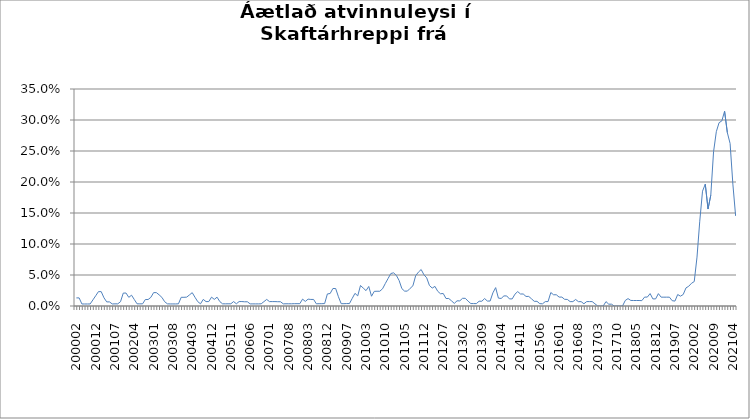
| Category | Series 0 |
|---|---|
| 200002 | 0.013 |
| 200003 | 0.013 |
| 200004 | 0.003 |
| 200005 | 0.003 |
| 200006 | 0.003 |
| 200007 | 0.003 |
| 200011 | 0.01 |
| 200012 | 0.017 |
| 200101 | 0.023 |
| 200102 | 0.023 |
| 200103 | 0.013 |
| 200104 | 0.007 |
| 200105 | 0.007 |
| 200106 | 0.003 |
| 200107 | 0.003 |
| 200108 | 0.003 |
| 200111 | 0.007 |
| 200112 | 0.021 |
| 200201 | 0.021 |
| 200202 | 0.014 |
| 200203 | 0.017 |
| 200204 | 0.01 |
| 200205 | 0.003 |
| 200206 | 0.003 |
| 200207 | 0.003 |
| 200210 | 0.01 |
| 200211 | 0.01 |
| 200212 | 0.014 |
| 200301 | 0.022 |
| 200302 | 0.022 |
| 200303 | 0.018 |
| 200304 | 0.014 |
| 200305 | 0.007 |
| 200306 | 0.003 |
| 200307 | 0.003 |
| 200308 | 0.003 |
| 200309 | 0.003 |
| 200310 | 0.004 |
| 200311 | 0.014 |
| 200312 | 0.014 |
| 200401 | 0.014 |
| 200402 | 0.018 |
| 200403 | 0.022 |
| 200404 | 0.014 |
| 200405 | 0.007 |
| 200406 | 0.004 |
| 200407 | 0.011 |
| 200408 | 0.007 |
| 200411 | 0.007 |
| 200412 | 0.014 |
| 200501 | 0.011 |
| 200502 | 0.014 |
| 200503 | 0.007 |
| 200504 | 0.004 |
| 200505 | 0.004 |
| 200510 | 0.004 |
| 200511 | 0.004 |
| 200512 | 0.007 |
| 200601 | 0.004 |
| 200602 | 0.007 |
| 200603 | 0.007 |
| 200604 | 0.007 |
| 200605 | 0.007 |
| 200606 | 0.003 |
| 200607 | 0.003 |
| 200608 | 0.003 |
| 200609 | 0.003 |
| 200610 | 0.004 |
| 200611 | 0.007 |
| 200612 | 0.011 |
| 200701 | 0.007 |
| 200702 | 0.007 |
| 200703 | 0.007 |
| 200704 | 0.007 |
| 200705 | 0.007 |
| 200706 | 0.003 |
| 200707 | 0.004 |
| 200708 | 0.004 |
| 200709 | 0.004 |
| 200710 | 0.004 |
| 200711 | 0.004 |
| 200712 | 0.004 |
| 200801 | 0.011 |
| 200802 | 0.007 |
| 200803 | 0.011 |
| 200804 | 0.011 |
| 200805 | 0.011 |
| 200806 | 0.004 |
| 200807 | 0.004 |
| 200808 | 0.004 |
| 200811 | 0.004 |
| 200812 | 0.019 |
| 200901 | 0.02 |
| 200902 | 0.028 |
| 200903 | 0.028 |
| 200904 | 0.015 |
| 200905 | 0.004 |
| 200906 | 0.004 |
| 200907 | 0.004 |
| 200908 | 0.004 |
| 200910 | 0.012 |
| 200911 | 0.02 |
| 200912 | 0.016 |
| 201001 | 0.033 |
| 201002 | 0.029 |
| 201003 | 0.025 |
| 201004 | 0.031 |
| 201005 | 0.016 |
| 201006 | 0.024 |
| 201007 | 0.024 |
| 201008 | 0.024 |
| 201009 | 0.028 |
| 201010 | 0.036 |
| 201011 | 0.044 |
| 201012 | 0.052 |
| 201101 | 0.053 |
| 201102 | 0.049 |
| 201103 | 0.041 |
| 201104 | 0.028 |
| 201105 | 0.024 |
| 201106 | 0.024 |
| 201107 | 0.028 |
| 201108 | 0.033 |
| 201109 | 0.049 |
| 201110 | 0.055 |
| 201111 | 0.059 |
| 201112 | 0.05 |
| 201201 | 0.045 |
| 201202 | 0.033 |
| 201203 | 0.029 |
| 201204 | 0.032 |
| 201205 | 0.024 |
| 201206 | 0.02 |
| 201207 | 0.02 |
| 201208 | 0.012 |
| 201209 | 0.012 |
| 201210 | 0.008 |
| 201211 | 0.004 |
| 201212 | 0.008 |
| 201301 | 0.008 |
| 201302 | 0.012 |
| 201303 | 0.012 |
| 201304 | 0.008 |
| 201305 | 0.004 |
| 201306 | 0.004 |
| 201307 | 0.004 |
| 201308 | 0.008 |
| 201309 | 0.008 |
| 201310 | 0.012 |
| 201311 | 0.008 |
| 201312 | 0.008 |
| 201401 | 0.021 |
| 201402 | 0.03 |
| 201403 | 0.013 |
| 201404 | 0.012 |
| 201405 | 0.016 |
| 201406 | 0.016 |
| 201407 | 0.011 |
| 201408 | 0.011 |
| 201409 | 0.019 |
| 201410 | 0.023 |
| 201411 | 0.019 |
| 201412 | 0.019 |
| 201501 | 0.015 |
| 201502 | 0.015 |
| 201503 | 0.012 |
| 201504 | 0.008 |
| 201505 | 0.008 |
| 201506 | 0.004 |
| 201507 | 0.004 |
| 201508 | 0.007 |
| 201509 | 0.007 |
| 201510 | 0.022 |
| 201511 | 0.018 |
| 201512 | 0.018 |
| 201601 | 0.014 |
| 201602 | 0.014 |
| 201603 | 0.011 |
| 201604 | 0.011 |
| 201605 | 0.007 |
| 201606 | 0.007 |
| 201607 | 0.011 |
| 201608 | 0.007 |
| 201609 | 0.007 |
| 201610 | 0.004 |
| 201611 | 0.007 |
| 201612 | 0.007 |
| 201701 | 0.007 |
| 201702 | 0.004 |
| 201703 | 0 |
| 201704 | 0 |
| 201705 | 0 |
| 201706 | 0.007 |
| 201707 | 0.003 |
| 201708 | 0.003 |
| 201709 | 0 |
| 201710 | 0 |
| 201711 | 0 |
| 201712 | 0 |
| 201801 | 0.009 |
| 201802 | 0.012 |
| 201803 | 0.009 |
| 201804 | 0.009 |
| 201805 | 0.009 |
| 201806 | 0.009 |
| 201807 | 0.009 |
| 201808 | 0.014 |
| 201809 | 0.014 |
| 201810 | 0.02 |
| 201811 | 0.011 |
| 201812 | 0.011 |
| 201901 | 0.02 |
| 201902 | 0.014 |
| 201903 | 0.014 |
| 201904 | 0.014 |
| 201905 | 0.014 |
| 201906 | 0.009 |
| 201907 | 0.008 |
| 201908 | 0.019 |
| 201909 | 0.016 |
| 201910 | 0.019 |
| 201911 | 0.029 |
| 201912 | 0.032 |
| 202001 | 0.037 |
| 202002 | 0.039 |
| 202003 | 0.079 |
| 202004 | 0.137 |
| 202005 | 0.185 |
| 202006 | 0.197 |
| 202007 | 0.156 |
| 202008 | 0.179 |
| 202009 | 0.249 |
| 202010 | 0.281 |
| 202011 | 0.296 |
| 202012 | 0.299 |
| 202101 | 0.314 |
| 202102 | 0.28 |
| 202103 | 0.262 |
| 202104 | 0.197 |
| 202105 | 0.145 |